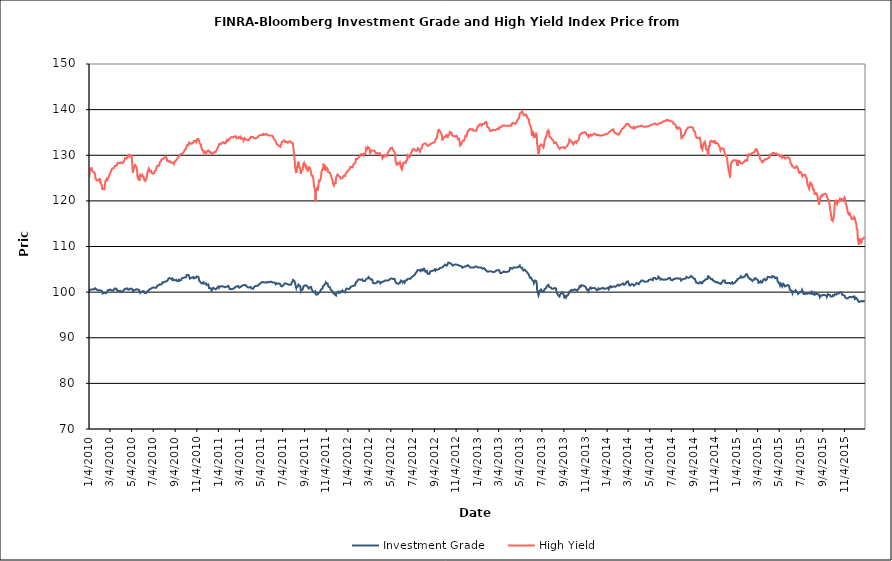
| Category | Investment Grade | High Yield |
|---|---|---|
| 1/4/10 | 100.102 | 125.163 |
| 1/5/10 | 100.49 | 125.873 |
| 1/6/10 | 100.447 | 126.69 |
| 1/7/10 | 100.503 | 127.071 |
| 1/8/10 | 100.542 | 127.104 |
| 1/11/10 | 100.559 | 127.199 |
| 1/12/10 | 100.775 | 126.595 |
| 1/13/10 | 100.668 | 126.609 |
| 1/14/10 | 100.647 | 126.495 |
| 1/15/10 | 100.825 | 126.376 |
| 1/19/10 | 100.604 | 126.186 |
| 1/20/10 | 100.724 | 126.008 |
| 1/21/10 | 100.842 | 125.662 |
| 1/22/10 | 100.705 | 124.921 |
| 1/25/10 | 100.59 | 124.498 |
| 1/26/10 | 100.603 | 124.395 |
| 1/27/10 | 100.508 | 124.599 |
| 1/28/10 | 100.405 | 124.548 |
| 1/29/10 | 100.417 | 124.508 |
| 2/1/10 | 100.394 | 124.505 |
| 2/2/10 | 100.469 | 124.725 |
| 2/3/10 | 100.363 | 124.969 |
| 2/4/10 | 100.396 | 124.762 |
| 2/5/10 | 100.385 | 123.977 |
| 2/8/10 | 100.291 | 123.526 |
| 2/9/10 | 100.167 | 123.238 |
| 2/10/10 | 99.997 | 122.602 |
| 2/11/10 | 99.691 | 122.473 |
| 2/12/10 | 99.896 | 122.576 |
| 2/16/10 | 99.868 | 122.529 |
| 2/17/10 | 99.849 | 123.433 |
| 2/18/10 | 99.79 | 123.864 |
| 2/19/10 | 99.757 | 124.339 |
| 2/22/10 | 99.858 | 124.755 |
| 2/23/10 | 100.056 | 124.527 |
| 2/24/10 | 100.143 | 124.602 |
| 2/25/10 | 100.208 | 124.538 |
| 2/26/10 | 100.466 | 124.842 |
| 3/1/10 | 100.447 | 125.466 |
| 3/2/10 | 100.481 | 125.66 |
| 3/3/10 | 100.547 | 125.78 |
| 3/4/10 | 100.572 | 125.898 |
| 3/5/10 | 100.406 | 126.217 |
| 3/8/10 | 100.383 | 126.711 |
| 3/9/10 | 100.445 | 126.852 |
| 3/10/10 | 100.329 | 127.106 |
| 3/11/10 | 100.316 | 127.14 |
| 3/12/10 | 100.488 | 127.262 |
| 3/15/10 | 100.522 | 127.212 |
| 3/16/10 | 100.654 | 127.15 |
| 3/17/10 | 100.794 | 127.664 |
| 3/18/10 | 100.787 | 127.842 |
| 3/19/10 | 100.77 | 127.776 |
| 3/22/10 | 100.728 | 127.676 |
| 3/23/10 | 100.762 | 127.779 |
| 3/24/10 | 100.328 | 128.048 |
| 3/25/10 | 100.142 | 128.082 |
| 3/26/10 | 100.176 | 128.355 |
| 3/29/10 | 100.218 | 128.357 |
| 3/30/10 | 100.26 | 128.526 |
| 3/31/10 | 100.4 | 128.354 |
| 4/1/10 | 100.318 | 128.234 |
| 4/5/10 | 99.992 | 128.435 |
| 4/6/10 | 99.974 | 128.282 |
| 4/7/10 | 100.148 | 128.468 |
| 4/8/10 | 100.17 | 128.282 |
| 4/9/10 | 100.252 | 128.463 |
| 4/12/10 | 100.46 | 128.647 |
| 4/13/10 | 100.602 | 128.822 |
| 4/14/10 | 100.658 | 129.085 |
| 4/15/10 | 100.72 | 129.378 |
| 4/16/10 | 100.861 | 129.541 |
| 4/19/10 | 100.72 | 129.254 |
| 4/20/10 | 100.713 | 129.364 |
| 4/21/10 | 100.841 | 129.516 |
| 4/22/10 | 100.818 | 129.413 |
| 4/23/10 | 100.588 | 129.707 |
| 4/26/10 | 100.539 | 130.023 |
| 4/27/10 | 100.749 | 129.974 |
| 4/28/10 | 100.637 | 129.76 |
| 4/29/10 | 100.695 | 130.026 |
| 4/30/10 | 100.908 | 129.932 |
| 5/3/10 | 100.788 | 129.878 |
| 5/4/10 | 100.905 | 129.637 |
| 5/5/10 | 100.862 | 128.685 |
| 5/6/10 | 100.609 | 127.446 |
| 5/7/10 | 100.233 | 126.211 |
| 5/10/10 | 100.404 | 127.273 |
| 5/11/10 | 100.358 | 127.056 |
| 5/12/10 | 100.306 | 127.684 |
| 5/13/10 | 100.48 | 128.088 |
| 5/14/10 | 100.68 | 127.605 |
| 5/17/10 | 100.617 | 127.473 |
| 5/18/10 | 100.721 | 127.395 |
| 5/19/10 | 100.652 | 126.706 |
| 5/20/10 | 100.6 | 125.442 |
| 5/21/10 | 100.415 | 125.086 |
| 5/24/10 | 100.481 | 125.319 |
| 5/25/10 | 100.136 | 124.396 |
| 5/26/10 | 100.104 | 124.91 |
| 5/27/10 | 99.874 | 125.323 |
| 5/28/10 | 100.099 | 125.704 |
| 6/1/10 | 100.03 | 125.412 |
| 6/2/10 | 99.906 | 125.392 |
| 6/3/10 | 99.946 | 125.704 |
| 6/4/10 | 100.231 | 125.471 |
| 6/7/10 | 100.206 | 125.2 |
| 6/8/10 | 100.11 | 124.677 |
| 6/9/10 | 100.083 | 124.67 |
| 6/10/10 | 99.801 | 124.634 |
| 6/11/10 | 99.808 | 124.35 |
| 6/14/10 | 99.829 | 124.765 |
| 6/15/10 | 99.86 | 125.1 |
| 6/16/10 | 99.92 | 125.477 |
| 6/17/10 | 100.239 | 126.08 |
| 6/18/10 | 100.29 | 126.379 |
| 6/21/10 | 100.344 | 127.069 |
| 6/22/10 | 100.487 | 126.885 |
| 6/23/10 | 100.61 | 126.856 |
| 6/24/10 | 100.569 | 126.505 |
| 6/25/10 | 100.558 | 126.6 |
| 6/28/10 | 100.784 | 126.599 |
| 6/29/10 | 100.881 | 126.131 |
| 6/30/10 | 100.978 | 126.332 |
| 7/1/10 | 100.965 | 125.953 |
| 7/2/10 | 100.974 | 125.967 |
| 7/6/10 | 101.028 | 126.06 |
| 7/7/10 | 100.928 | 126.207 |
| 7/8/10 | 100.951 | 126.563 |
| 7/9/10 | 100.945 | 126.756 |
| 7/12/10 | 100.939 | 126.793 |
| 7/13/10 | 100.992 | 127.434 |
| 7/14/10 | 100.998 | 127.449 |
| 7/15/10 | 101.414 | 127.578 |
| 7/16/10 | 101.574 | 127.717 |
| 7/19/10 | 101.508 | 127.688 |
| 7/20/10 | 101.593 | 127.776 |
| 7/21/10 | 101.672 | 127.949 |
| 7/22/10 | 101.721 | 128.3 |
| 7/23/10 | 101.691 | 128.582 |
| 7/26/10 | 101.665 | 128.726 |
| 7/27/10 | 101.716 | 129.049 |
| 7/28/10 | 101.723 | 129.168 |
| 7/29/10 | 101.885 | 128.993 |
| 7/30/10 | 102.177 | 129.176 |
| 8/2/10 | 102.135 | 129.303 |
| 8/3/10 | 102.299 | 129.487 |
| 8/4/10 | 102.207 | 129.465 |
| 8/5/10 | 102.25 | 129.5 |
| 8/6/10 | 102.431 | 129.631 |
| 8/9/10 | 102.373 | 129.675 |
| 8/10/10 | 102.438 | 129.445 |
| 8/11/10 | 102.495 | 129.168 |
| 8/12/10 | 102.453 | 128.755 |
| 8/13/10 | 102.521 | 128.568 |
| 8/16/10 | 102.995 | 128.643 |
| 8/17/10 | 102.924 | 128.731 |
| 8/18/10 | 102.975 | 128.831 |
| 8/19/10 | 103.087 | 128.733 |
| 8/20/10 | 102.992 | 128.508 |
| 8/23/10 | 102.902 | 128.534 |
| 8/24/10 | 103.11 | 128.37 |
| 8/25/10 | 103.069 | 128.303 |
| 8/26/10 | 103.004 | 128.195 |
| 8/27/10 | 102.638 | 128.262 |
| 8/30/10 | 102.77 | 128.382 |
| 8/31/10 | 102.91 | 128.147 |
| 9/1/10 | 102.667 | 128.36 |
| 9/2/10 | 102.558 | 128.62 |
| 9/3/10 | 102.437 | 128.836 |
| 9/7/10 | 102.695 | 128.945 |
| 9/8/10 | 102.694 | 128.974 |
| 9/9/10 | 102.414 | 129.155 |
| 9/10/10 | 102.242 | 129.258 |
| 9/13/10 | 102.438 | 129.602 |
| 9/14/10 | 102.704 | 129.521 |
| 9/15/10 | 102.649 | 129.674 |
| 9/16/10 | 102.499 | 130.074 |
| 9/17/10 | 102.528 | 130.135 |
| 9/20/10 | 102.632 | 130.295 |
| 9/21/10 | 102.768 | 130.466 |
| 9/22/10 | 103.038 | 130.485 |
| 9/23/10 | 103.079 | 130.298 |
| 9/24/10 | 102.892 | 130.335 |
| 9/27/10 | 103.136 | 130.598 |
| 9/28/10 | 103.196 | 130.688 |
| 9/29/10 | 103.217 | 130.894 |
| 9/30/10 | 103.213 | 131.102 |
| 10/1/10 | 103.293 | 131.255 |
| 10/4/10 | 103.25 | 131.415 |
| 10/5/10 | 103.36 | 131.667 |
| 10/6/10 | 103.777 | 131.956 |
| 10/7/10 | 103.821 | 132.099 |
| 10/8/10 | 103.882 | 132.244 |
| 10/11/10 | 103.749 | 132.212 |
| 10/12/10 | 103.668 | 132.314 |
| 10/13/10 | 103.535 | 132.793 |
| 10/14/10 | 103.235 | 132.644 |
| 10/15/10 | 102.972 | 132.584 |
| 10/18/10 | 103.11 | 132.508 |
| 10/19/10 | 103.211 | 132.456 |
| 10/20/10 | 103.237 | 132.329 |
| 10/21/10 | 103.168 | 132.579 |
| 10/22/10 | 103.146 | 132.563 |
| 10/25/10 | 103.321 | 132.824 |
| 10/26/10 | 103.025 | 133.129 |
| 10/27/10 | 102.808 | 133.066 |
| 10/28/10 | 102.914 | 133.18 |
| 10/29/10 | 103.11 | 133.087 |
| 11/1/10 | 103.142 | 133.192 |
| 11/2/10 | 103.332 | 132.962 |
| 11/3/10 | 103.438 | 133.19 |
| 11/4/10 | 103.58 | 133.536 |
| 11/5/10 | 103.406 | 133.536 |
| 11/8/10 | 103.31 | 133.557 |
| 11/9/10 | 103.055 | 133.593 |
| 11/10/10 | 102.564 | 133.022 |
| 11/11/10 | 102.616 | 132.97 |
| 11/12/10 | 102.468 | 132.524 |
| 11/15/10 | 102.045 | 132.371 |
| 11/16/10 | 101.932 | 131.763 |
| 11/17/10 | 102.112 | 131.511 |
| 11/18/10 | 101.897 | 131.639 |
| 11/19/10 | 102.054 | 131.122 |
| 11/22/10 | 102.165 | 131.019 |
| 11/23/10 | 102.278 | 130.588 |
| 11/24/10 | 101.864 | 130.542 |
| 11/26/10 | 101.863 | 130.744 |
| 11/29/10 | 101.922 | 130.291 |
| 11/30/10 | 102.022 | 130.145 |
| 12/1/10 | 101.568 | 130.481 |
| 12/2/10 | 101.476 | 130.838 |
| 12/3/10 | 101.519 | 130.961 |
| 12/6/10 | 101.694 | 131.045 |
| 12/7/10 | 101.352 | 131.156 |
| 12/8/10 | 100.876 | 130.842 |
| 12/9/10 | 100.991 | 130.879 |
| 12/10/10 | 100.934 | 130.643 |
| 12/13/10 | 100.857 | 130.642 |
| 12/14/10 | 100.596 | 130.565 |
| 12/15/10 | 100.33 | 130.335 |
| 12/16/10 | 100.307 | 130.398 |
| 12/17/10 | 100.602 | 130.396 |
| 12/20/10 | 100.943 | 130.42 |
| 12/21/10 | 100.841 | 130.656 |
| 12/22/10 | 100.868 | 130.633 |
| 12/23/10 | 100.766 | 130.815 |
| 12/27/10 | 100.627 | 130.708 |
| 12/28/10 | 100.526 | 130.99 |
| 12/29/10 | 100.688 | 131.074 |
| 12/30/10 | 100.846 | 131.261 |
| 12/31/10 | 101.042 | 131.455 |
| 1/3/11 | 101.208 | 131.858 |
| 1/4/11 | 101.316 | 132.091 |
| 1/5/11 | 100.937 | 132.302 |
| 1/6/11 | 100.955 | 132.482 |
| 1/7/11 | 101.214 | 132.404 |
| 1/10/11 | 101.247 | 132.434 |
| 1/11/11 | 101.24 | 132.58 |
| 1/12/11 | 101.18 | 132.636 |
| 1/13/11 | 101.307 | 132.753 |
| 1/14/11 | 101.392 | 132.788 |
| 1/18/11 | 101.21 | 132.849 |
| 1/19/11 | 101.349 | 132.835 |
| 1/20/11 | 101.094 | 132.594 |
| 1/21/11 | 101.074 | 132.574 |
| 1/24/11 | 101.163 | 132.632 |
| 1/25/11 | 101.328 | 132.944 |
| 1/26/11 | 101.147 | 133.021 |
| 1/27/11 | 101.186 | 133.283 |
| 1/28/11 | 101.332 | 133.054 |
| 1/31/11 | 101.371 | 133.197 |
| 2/1/11 | 101.177 | 133.376 |
| 2/2/11 | 101.113 | 133.508 |
| 2/3/11 | 100.901 | 133.416 |
| 2/4/11 | 100.688 | 133.653 |
| 2/7/11 | 100.708 | 133.883 |
| 2/8/11 | 100.678 | 134.026 |
| 2/9/11 | 100.64 | 134.065 |
| 2/10/11 | 100.635 | 134.006 |
| 2/11/11 | 100.689 | 133.906 |
| 2/14/11 | 100.76 | 133.89 |
| 2/15/11 | 100.792 | 133.913 |
| 2/16/11 | 100.816 | 134.016 |
| 2/17/11 | 100.877 | 134.107 |
| 2/18/11 | 100.849 | 134.178 |
| 2/22/11 | 101.209 | 134.145 |
| 2/23/11 | 101.204 | 133.96 |
| 2/24/11 | 101.068 | 133.689 |
| 2/25/11 | 101.217 | 133.737 |
| 2/28/11 | 101.347 | 133.797 |
| 3/1/11 | 101.398 | 133.935 |
| 3/2/11 | 101.379 | 133.992 |
| 3/3/11 | 100.969 | 134.003 |
| 3/4/11 | 101.076 | 133.893 |
| 3/7/11 | 101.137 | 133.668 |
| 3/8/11 | 101.019 | 133.964 |
| 3/9/11 | 101.172 | 133.956 |
| 3/10/11 | 101.344 | 133.656 |
| 3/11/11 | 101.44 | 133.576 |
| 3/14/11 | 101.514 | 133.638 |
| 3/15/11 | 101.535 | 133.214 |
| 3/16/11 | 101.719 | 133.178 |
| 3/17/11 | 101.535 | 133.421 |
| 3/18/11 | 101.606 | 133.749 |
| 3/21/11 | 101.533 | 133.484 |
| 3/22/11 | 101.512 | 133.544 |
| 3/23/11 | 101.421 | 133.408 |
| 3/24/11 | 101.267 | 133.44 |
| 3/25/11 | 101.138 | 133.353 |
| 3/28/11 | 101.016 | 133.284 |
| 3/29/11 | 100.882 | 133.292 |
| 3/30/11 | 100.871 | 133.463 |
| 3/31/11 | 101.038 | 133.352 |
| 4/1/11 | 100.887 | 133.702 |
| 4/4/11 | 101.136 | 133.797 |
| 4/5/11 | 100.963 | 134.02 |
| 4/6/11 | 100.836 | 133.92 |
| 4/7/11 | 100.781 | 133.902 |
| 4/8/11 | 100.76 | 134.004 |
| 4/11/11 | 100.727 | 134.028 |
| 4/12/11 | 100.924 | 133.848 |
| 4/13/11 | 101.032 | 133.808 |
| 4/14/11 | 101.001 | 133.714 |
| 4/15/11 | 101.239 | 133.871 |
| 4/18/11 | 101.36 | 133.65 |
| 4/19/11 | 101.451 | 133.651 |
| 4/20/11 | 101.424 | 133.737 |
| 4/21/11 | 101.387 | 133.825 |
| 4/25/11 | 101.419 | 133.988 |
| 4/26/11 | 101.611 | 134.092 |
| 4/27/11 | 101.48 | 134.04 |
| 4/28/11 | 101.708 | 134.311 |
| 4/29/11 | 101.828 | 134.333 |
| 5/2/11 | 101.906 | 134.443 |
| 5/3/11 | 101.997 | 134.32 |
| 5/4/11 | 102.075 | 134.479 |
| 5/5/11 | 102.171 | 134.418 |
| 5/6/11 | 102.158 | 134.578 |
| 5/9/11 | 102.209 | 134.425 |
| 5/10/11 | 102.082 | 134.688 |
| 5/11/11 | 102.109 | 134.7 |
| 5/12/11 | 102.099 | 134.527 |
| 5/13/11 | 102.138 | 134.491 |
| 5/16/11 | 102.149 | 134.632 |
| 5/17/11 | 102.353 | 134.587 |
| 5/18/11 | 102.212 | 134.566 |
| 5/19/11 | 102.07 | 134.636 |
| 5/20/11 | 102.132 | 134.542 |
| 5/23/11 | 102.226 | 134.352 |
| 5/24/11 | 102.138 | 134.411 |
| 5/25/11 | 102.088 | 134.326 |
| 5/26/11 | 102.164 | 134.342 |
| 5/27/11 | 102.195 | 134.51 |
| 5/31/11 | 102.313 | 134.338 |
| 6/1/11 | 102.499 | 134.385 |
| 6/2/11 | 102.253 | 134.221 |
| 6/3/11 | 102.189 | 134.283 |
| 6/6/11 | 102.12 | 134.159 |
| 6/7/11 | 102.072 | 133.967 |
| 6/8/11 | 102.173 | 133.704 |
| 6/9/11 | 102.106 | 133.568 |
| 6/10/11 | 102.076 | 133.506 |
| 6/13/11 | 102.012 | 133.153 |
| 6/14/11 | 101.73 | 133.037 |
| 6/15/11 | 101.868 | 132.872 |
| 6/16/11 | 101.948 | 132.554 |
| 6/17/11 | 101.926 | 132.653 |
| 6/20/11 | 101.853 | 132.269 |
| 6/21/11 | 101.876 | 132.267 |
| 6/22/11 | 101.873 | 132.44 |
| 6/23/11 | 101.908 | 132.05 |
| 6/24/11 | 102.002 | 132.113 |
| 6/27/11 | 101.741 | 131.865 |
| 6/28/11 | 101.402 | 132.191 |
| 6/29/11 | 101.26 | 132.363 |
| 6/30/11 | 101.2 | 132.454 |
| 7/1/11 | 101.237 | 132.902 |
| 7/5/11 | 101.449 | 133.029 |
| 7/6/11 | 101.506 | 133.115 |
| 7/7/11 | 101.395 | 133.231 |
| 7/8/11 | 101.8 | 133.28 |
| 7/11/11 | 101.933 | 132.888 |
| 7/12/11 | 102.014 | 132.784 |
| 7/13/11 | 102.042 | 132.957 |
| 7/14/11 | 101.89 | 132.999 |
| 7/15/11 | 101.851 | 132.866 |
| 7/18/11 | 101.732 | 132.724 |
| 7/19/11 | 101.677 | 132.722 |
| 7/20/11 | 101.802 | 132.936 |
| 7/21/11 | 101.598 | 133.028 |
| 7/22/11 | 101.707 | 133.068 |
| 7/25/11 | 101.6 | 133.049 |
| 7/26/11 | 101.668 | 133.246 |
| 7/27/11 | 101.671 | 132.951 |
| 7/28/11 | 101.71 | 132.748 |
| 7/29/11 | 102.101 | 132.541 |
| 8/1/11 | 102.445 | 132.668 |
| 8/2/11 | 102.69 | 132.126 |
| 8/3/11 | 102.765 | 131.582 |
| 8/4/11 | 102.858 | 130.856 |
| 8/5/11 | 102.526 | 130.297 |
| 8/8/11 | 101.818 | 127.319 |
| 8/9/11 | 101.642 | 126.715 |
| 8/10/11 | 101.666 | 126.678 |
| 8/11/11 | 100.881 | 126.106 |
| 8/12/11 | 101.126 | 127.015 |
| 8/15/11 | 101.191 | 127.903 |
| 8/16/11 | 101.405 | 128.042 |
| 8/17/11 | 101.631 | 128.573 |
| 8/18/11 | 101.692 | 127.705 |
| 8/19/11 | 101.529 | 127.395 |
| 8/22/11 | 101.314 | 127.264 |
| 8/23/11 | 100.821 | 126.282 |
| 8/24/11 | 100.273 | 125.927 |
| 8/25/11 | 100.448 | 126.498 |
| 8/26/11 | 100.592 | 126.715 |
| 8/29/11 | 100.573 | 126.885 |
| 8/30/11 | 101.003 | 127.033 |
| 8/31/11 | 101.14 | 128.078 |
| 9/1/11 | 101.324 | 128.205 |
| 9/2/11 | 101.474 | 128.365 |
| 9/6/11 | 101.516 | 127.515 |
| 9/7/11 | 101.486 | 127.765 |
| 9/8/11 | 101.502 | 127.727 |
| 9/9/11 | 101.426 | 127.519 |
| 9/12/11 | 101.178 | 126.474 |
| 9/13/11 | 100.959 | 126.623 |
| 9/14/11 | 100.983 | 127.097 |
| 9/15/11 | 100.799 | 127.314 |
| 9/16/11 | 100.88 | 127.409 |
| 9/19/11 | 101.097 | 127.172 |
| 9/20/11 | 101.095 | 127.29 |
| 9/21/11 | 101.153 | 127.116 |
| 9/22/11 | 101.108 | 125.995 |
| 9/23/11 | 100.647 | 125.52 |
| 9/26/11 | 100.298 | 125.465 |
| 9/27/11 | 100.058 | 125.611 |
| 9/28/11 | 99.924 | 124.851 |
| 9/29/11 | 99.972 | 124.344 |
| 9/30/11 | 99.996 | 123.273 |
| 10/3/11 | 100.148 | 122.236 |
| 10/4/11 | 99.594 | 119.881 |
| 10/5/11 | 99.418 | 120.775 |
| 10/6/11 | 99.443 | 122.277 |
| 10/7/11 | 99.434 | 122.768 |
| 10/10/11 | 99.517 | 122.852 |
| 10/11/11 | 99.353 | 122.3 |
| 10/12/11 | 99.527 | 123.376 |
| 10/13/11 | 99.78 | 123.672 |
| 10/14/11 | 99.81 | 124.466 |
| 10/17/11 | 100.031 | 124.417 |
| 10/18/11 | 100.25 | 124.296 |
| 10/19/11 | 100.53 | 124.939 |
| 10/20/11 | 100.68 | 125.541 |
| 10/21/11 | 100.707 | 126.394 |
| 10/24/11 | 100.807 | 126.914 |
| 10/25/11 | 101.264 | 127.167 |
| 10/26/11 | 101.368 | 126.792 |
| 10/27/11 | 101.348 | 127.975 |
| 10/28/11 | 101.463 | 127.875 |
| 10/31/11 | 101.784 | 127.696 |
| 11/1/11 | 101.959 | 126.648 |
| 11/2/11 | 102.125 | 126.978 |
| 11/3/11 | 102.008 | 127.376 |
| 11/4/11 | 101.874 | 127.162 |
| 11/7/11 | 101.905 | 127.097 |
| 11/8/11 | 101.595 | 127.239 |
| 11/9/11 | 101.39 | 126.322 |
| 11/10/11 | 101.173 | 126.414 |
| 11/11/11 | 101.238 | 126.491 |
| 11/14/11 | 101.069 | 126.17 |
| 11/15/11 | 100.767 | 125.82 |
| 11/16/11 | 100.761 | 125.629 |
| 11/17/11 | 100.469 | 125.434 |
| 11/18/11 | 100.413 | 125.196 |
| 11/21/11 | 100.183 | 124.532 |
| 11/22/11 | 99.951 | 123.879 |
| 11/23/11 | 99.805 | 123.809 |
| 11/25/11 | 99.664 | 123.358 |
| 11/28/11 | 99.47 | 124.094 |
| 11/29/11 | 99.414 | 123.689 |
| 11/30/11 | 99.404 | 124.084 |
| 12/1/11 | 99.27 | 124.86 |
| 12/2/11 | 99.785 | 125.29 |
| 12/5/11 | 99.93 | 125.775 |
| 12/6/11 | 99.982 | 125.795 |
| 12/7/11 | 99.949 | 125.612 |
| 12/8/11 | 100.115 | 125.538 |
| 12/9/11 | 99.872 | 125.454 |
| 12/12/11 | 99.867 | 125.317 |
| 12/13/11 | 99.906 | 125.158 |
| 12/14/11 | 100 | 124.913 |
| 12/15/11 | 100.134 | 124.961 |
| 12/16/11 | 100.313 | 125.058 |
| 12/19/11 | 100.375 | 124.938 |
| 12/20/11 | 100.196 | 125.175 |
| 12/21/11 | 100.097 | 125.223 |
| 12/22/11 | 100.134 | 125.503 |
| 12/23/11 | 100.016 | 125.63 |
| 12/27/11 | 99.947 | 125.464 |
| 12/28/11 | 100.421 | 125.864 |
| 12/29/11 | 100.555 | 126.044 |
| 12/30/11 | 100.774 | 126.162 |
| 1/3/12 | 100.742 | 126.521 |
| 1/4/12 | 100.597 | 126.529 |
| 1/5/12 | 100.548 | 126.663 |
| 1/6/12 | 100.672 | 126.824 |
| 1/9/12 | 100.818 | 127.016 |
| 1/10/12 | 100.91 | 127.393 |
| 1/11/12 | 101.119 | 127.414 |
| 1/12/12 | 101.246 | 127.571 |
| 1/13/12 | 101.324 | 127.463 |
| 1/17/12 | 101.365 | 127.36 |
| 1/18/12 | 101.455 | 127.435 |
| 1/19/12 | 101.448 | 128.026 |
| 1/20/12 | 101.421 | 128.07 |
| 1/23/12 | 101.433 | 128.175 |
| 1/24/12 | 101.349 | 128.221 |
| 1/25/12 | 101.65 | 128.487 |
| 1/26/12 | 102.102 | 129.167 |
| 1/27/12 | 102.266 | 129.213 |
| 1/30/12 | 102.431 | 129.164 |
| 1/31/12 | 102.58 | 129.039 |
| 2/1/12 | 102.574 | 129.405 |
| 2/2/12 | 102.767 | 129.511 |
| 2/3/12 | 102.65 | 129.574 |
| 2/6/12 | 102.774 | 129.798 |
| 2/7/12 | 102.668 | 129.809 |
| 2/8/12 | 102.826 | 130.217 |
| 2/9/12 | 102.679 | 130.377 |
| 2/10/12 | 102.743 | 130.002 |
| 2/13/12 | 102.811 | 130.239 |
| 2/14/12 | 102.821 | 130.083 |
| 2/15/12 | 102.83 | 130.106 |
| 2/16/12 | 102.429 | 129.967 |
| 2/17/12 | 102.479 | 130.307 |
| 2/21/12 | 102.463 | 130.284 |
| 2/22/12 | 102.57 | 130.67 |
| 2/23/12 | 102.664 | 130.956 |
| 2/24/12 | 102.855 | 131.597 |
| 2/27/12 | 103.004 | 131.368 |
| 2/28/12 | 103.144 | 131.529 |
| 2/29/12 | 103.205 | 131.808 |
| 3/1/12 | 103.025 | 131.852 |
| 3/2/12 | 103.284 | 131.736 |
| 3/5/12 | 103.056 | 131.389 |
| 3/6/12 | 102.929 | 130.339 |
| 3/7/12 | 102.889 | 130.576 |
| 3/8/12 | 102.775 | 130.669 |
| 3/9/12 | 102.69 | 131.049 |
| 3/12/12 | 102.756 | 131.049 |
| 3/13/12 | 102.485 | 131.146 |
| 3/14/12 | 102.022 | 131.244 |
| 3/15/12 | 101.978 | 131.069 |
| 3/16/12 | 102.017 | 131.099 |
| 3/19/12 | 101.918 | 130.958 |
| 3/20/12 | 101.786 | 130.727 |
| 3/21/12 | 102.027 | 130.902 |
| 3/22/12 | 101.958 | 130.559 |
| 3/23/12 | 102.123 | 130.411 |
| 3/26/12 | 102.121 | 130.481 |
| 3/27/12 | 102.364 | 130.583 |
| 3/28/12 | 102.343 | 130.551 |
| 3/29/12 | 102.348 | 130.289 |
| 3/30/12 | 102.304 | 130.504 |
| 4/2/12 | 102.275 | 130.507 |
| 4/3/12 | 102.178 | 130.54 |
| 4/4/12 | 101.896 | 130.313 |
| 4/5/12 | 101.959 | 130.066 |
| 4/9/12 | 102.29 | 129.724 |
| 4/10/12 | 102.336 | 129.341 |
| 4/11/12 | 102.227 | 129.316 |
| 4/12/12 | 102.258 | 129.646 |
| 4/13/12 | 102.438 | 129.816 |
| 4/16/12 | 102.512 | 129.715 |
| 4/17/12 | 102.447 | 129.998 |
| 4/18/12 | 102.478 | 130.062 |
| 4/19/12 | 102.542 | 130 |
| 4/20/12 | 102.456 | 130.072 |
| 4/23/12 | 102.528 | 129.844 |
| 4/24/12 | 102.45 | 130.122 |
| 4/25/12 | 102.376 | 130.54 |
| 4/26/12 | 102.526 | 130.61 |
| 4/27/12 | 102.624 | 130.774 |
| 4/30/12 | 102.764 | 131.097 |
| 5/1/12 | 102.747 | 131.422 |
| 5/2/12 | 102.891 | 131.549 |
| 5/3/12 | 102.958 | 131.559 |
| 5/4/12 | 103.036 | 131.564 |
| 5/7/12 | 102.967 | 131.646 |
| 5/8/12 | 103.069 | 131.43 |
| 5/9/12 | 102.922 | 131.22 |
| 5/10/12 | 102.853 | 131.368 |
| 5/11/12 | 102.937 | 131.343 |
| 5/14/12 | 102.896 | 130.719 |
| 5/15/12 | 102.777 | 130.618 |
| 5/16/12 | 102.436 | 130.036 |
| 5/17/12 | 102.22 | 128.787 |
| 5/18/12 | 102.02 | 128.397 |
| 5/21/12 | 101.935 | 127.807 |
| 5/22/12 | 101.836 | 128.404 |
| 5/23/12 | 101.909 | 128.029 |
| 5/24/12 | 101.806 | 128.076 |
| 5/25/12 | 101.934 | 128.245 |
| 5/29/12 | 102 | 128.512 |
| 5/30/12 | 102.241 | 128.252 |
| 5/31/12 | 102.454 | 128.088 |
| 6/1/12 | 102.529 | 127.354 |
| 6/4/12 | 102.342 | 126.898 |
| 6/5/12 | 102.151 | 126.694 |
| 6/6/12 | 102.104 | 127.566 |
| 6/7/12 | 102.302 | 128.314 |
| 6/8/12 | 102.404 | 128.144 |
| 6/11/12 | 102.405 | 128.406 |
| 6/12/12 | 102.158 | 128.202 |
| 6/13/12 | 102.242 | 128.297 |
| 6/14/12 | 102.219 | 128.278 |
| 6/15/12 | 102.624 | 128.671 |
| 6/18/12 | 102.678 | 128.831 |
| 6/19/12 | 102.678 | 129.471 |
| 6/20/12 | 102.731 | 129.982 |
| 6/21/12 | 102.928 | 130.01 |
| 6/22/12 | 102.86 | 129.877 |
| 6/25/12 | 102.926 | 129.569 |
| 6/26/12 | 102.827 | 129.662 |
| 6/27/12 | 102.871 | 129.855 |
| 6/28/12 | 102.95 | 129.949 |
| 6/29/12 | 102.908 | 130.465 |
| 7/2/12 | 103.372 | 130.772 |
| 7/3/12 | 103.438 | 131.071 |
| 7/5/12 | 103.483 | 131.238 |
| 7/6/12 | 103.617 | 131.405 |
| 7/9/12 | 103.743 | 131.298 |
| 7/10/12 | 103.882 | 131.313 |
| 7/11/12 | 103.974 | 131.355 |
| 7/12/12 | 104.078 | 130.988 |
| 7/13/12 | 104.213 | 131.017 |
| 7/16/12 | 104.502 | 130.976 |
| 7/17/12 | 104.542 | 130.994 |
| 7/18/12 | 104.84 | 131.143 |
| 7/19/12 | 104.904 | 131.518 |
| 7/20/12 | 104.869 | 131.357 |
| 7/23/12 | 104.76 | 131.103 |
| 7/24/12 | 104.857 | 130.931 |
| 7/25/12 | 104.856 | 130.805 |
| 7/26/12 | 104.899 | 131.091 |
| 7/27/12 | 104.627 | 131.355 |
| 7/30/12 | 104.84 | 131.604 |
| 7/31/12 | 105.028 | 131.948 |
| 8/1/12 | 104.967 | 132.255 |
| 8/2/12 | 105.058 | 132.124 |
| 8/3/12 | 104.808 | 132.261 |
| 8/6/12 | 105.018 | 132.559 |
| 8/7/12 | 104.746 | 132.745 |
| 8/8/12 | 104.638 | 132.59 |
| 8/9/12 | 104.469 | 132.581 |
| 8/10/12 | 104.646 | 132.362 |
| 8/13/12 | 104.659 | 132.342 |
| 8/14/12 | 104.381 | 132.345 |
| 8/15/12 | 104.02 | 132.073 |
| 8/16/12 | 103.908 | 132.068 |
| 8/17/12 | 103.944 | 132.003 |
| 8/20/12 | 103.998 | 132.164 |
| 8/21/12 | 104.025 | 132.365 |
| 8/22/12 | 104.353 | 132.42 |
| 8/23/12 | 104.574 | 132.471 |
| 8/24/12 | 104.535 | 132.536 |
| 8/27/12 | 104.634 | 132.588 |
| 8/28/12 | 104.679 | 132.662 |
| 8/29/12 | 104.564 | 132.576 |
| 8/30/12 | 104.666 | 132.748 |
| 8/31/12 | 104.854 | 132.757 |
| 9/4/12 | 104.974 | 132.816 |
| 9/5/12 | 104.888 | 132.819 |
| 9/6/12 | 104.737 | 133.125 |
| 9/7/12 | 104.978 | 133.605 |
| 9/10/12 | 104.878 | 133.705 |
| 9/11/12 | 104.922 | 134.088 |
| 9/12/12 | 104.881 | 134.64 |
| 9/13/12 | 104.964 | 134.936 |
| 9/14/12 | 104.926 | 135.468 |
| 9/17/12 | 105.058 | 135.563 |
| 9/18/12 | 105.16 | 135.387 |
| 9/19/12 | 105.306 | 135.375 |
| 9/20/12 | 105.214 | 135.117 |
| 9/21/12 | 105.236 | 135.047 |
| 9/24/12 | 105.353 | 134.578 |
| 9/25/12 | 105.333 | 134.277 |
| 9/26/12 | 105.396 | 133.268 |
| 9/27/12 | 105.535 | 133.642 |
| 9/28/12 | 105.652 | 133.797 |
| 10/1/12 | 105.785 | 133.896 |
| 10/2/12 | 105.876 | 133.835 |
| 10/3/12 | 105.971 | 133.992 |
| 10/4/12 | 106.042 | 134.162 |
| 10/5/12 | 105.919 | 134.321 |
| 10/8/12 | 105.81 | 134.45 |
| 10/9/12 | 105.946 | 134.131 |
| 10/10/12 | 105.923 | 133.801 |
| 10/11/12 | 106.139 | 134.188 |
| 10/12/12 | 106.424 | 134.299 |
| 10/15/12 | 106.445 | 134.521 |
| 10/16/12 | 106.447 | 134.767 |
| 10/17/12 | 106.444 | 135.122 |
| 10/18/12 | 106.326 | 135.204 |
| 10/19/12 | 106.271 | 135.012 |
| 10/22/12 | 106.114 | 134.922 |
| 10/23/12 | 105.996 | 134.365 |
| 10/24/12 | 105.971 | 134.527 |
| 10/25/12 | 105.806 | 134.564 |
| 10/26/12 | 105.938 | 134.21 |
| 10/29/12 | 105.958 | 134.185 |
| 10/30/12 | 105.958 | 134.185 |
| 10/31/12 | 106.102 | 134.104 |
| 11/1/12 | 106.069 | 134.15 |
| 11/2/12 | 106.005 | 134.287 |
| 11/5/12 | 106.032 | 134.281 |
| 11/6/12 | 105.82 | 134.439 |
| 11/7/12 | 105.9 | 133.937 |
| 11/8/12 | 105.923 | 133.875 |
| 11/9/12 | 105.877 | 133.542 |
| 11/12/12 | 105.86 | 133.603 |
| 11/13/12 | 105.873 | 133.044 |
| 11/14/12 | 105.848 | 132.789 |
| 11/15/12 | 105.744 | 132.136 |
| 11/16/12 | 105.693 | 131.979 |
| 11/19/12 | 105.653 | 132.5 |
| 11/20/12 | 105.532 | 132.869 |
| 11/21/12 | 105.358 | 132.945 |
| 11/23/12 | 105.388 | 133.147 |
| 11/26/12 | 105.534 | 133.19 |
| 11/27/12 | 105.586 | 133.501 |
| 11/28/12 | 105.642 | 133.554 |
| 11/29/12 | 105.643 | 133.926 |
| 11/30/12 | 105.715 | 134.285 |
| 12/3/12 | 105.696 | 134.168 |
| 12/4/12 | 105.727 | 134.386 |
| 12/5/12 | 105.874 | 134.874 |
| 12/6/12 | 105.901 | 135.085 |
| 12/7/12 | 105.741 | 135.362 |
| 12/10/12 | 105.722 | 135.452 |
| 12/11/12 | 105.635 | 135.61 |
| 12/12/12 | 105.563 | 135.761 |
| 12/13/12 | 105.422 | 135.826 |
| 12/14/12 | 105.506 | 135.725 |
| 12/17/12 | 105.385 | 135.641 |
| 12/18/12 | 105.191 | 135.742 |
| 12/19/12 | 105.36 | 135.775 |
| 12/20/12 | 105.386 | 135.706 |
| 12/21/12 | 105.493 | 135.434 |
| 12/24/12 | 105.382 | 135.434 |
| 12/26/12 | 105.438 | 135.223 |
| 12/27/12 | 105.63 | 135.36 |
| 12/28/12 | 105.717 | 135.388 |
| 12/31/12 | 105.623 | 135.388 |
| 1/2/13 | 105.494 | 136.004 |
| 1/3/13 | 105.419 | 136.223 |
| 1/4/13 | 105.349 | 136.418 |
| 1/7/13 | 105.428 | 136.539 |
| 1/8/13 | 105.485 | 136.567 |
| 1/9/13 | 105.45 | 136.666 |
| 1/10/13 | 105.382 | 136.791 |
| 1/11/13 | 105.347 | 136.887 |
| 1/14/13 | 105.372 | 136.76 |
| 1/15/13 | 105.348 | 136.538 |
| 1/16/13 | 105.332 | 136.64 |
| 1/17/13 | 105.127 | 136.744 |
| 1/18/13 | 105.195 | 136.872 |
| 1/22/13 | 105.239 | 136.901 |
| 1/23/13 | 105.259 | 137.065 |
| 1/24/13 | 105.154 | 137.18 |
| 1/25/13 | 104.918 | 137.344 |
| 1/28/13 | 104.671 | 137.292 |
| 1/29/13 | 104.628 | 136.915 |
| 1/30/13 | 104.462 | 136.633 |
| 1/31/13 | 104.489 | 136.183 |
| 2/1/13 | 104.509 | 136.3 |
| 2/4/13 | 104.516 | 135.996 |
| 2/5/13 | 104.38 | 135.778 |
| 2/6/13 | 104.452 | 135.607 |
| 2/7/13 | 104.557 | 135.447 |
| 2/8/13 | 104.482 | 135.313 |
| 2/11/13 | 104.548 | 135.322 |
| 2/12/13 | 104.435 | 135.393 |
| 2/13/13 | 104.331 | 135.446 |
| 2/14/13 | 104.432 | 135.524 |
| 2/15/13 | 104.394 | 135.504 |
| 2/19/13 | 104.387 | 135.572 |
| 2/20/13 | 104.348 | 135.627 |
| 2/21/13 | 104.499 | 135.402 |
| 2/22/13 | 104.557 | 135.485 |
| 2/25/13 | 104.756 | 135.664 |
| 2/26/13 | 104.841 | 135.55 |
| 2/27/13 | 104.778 | 135.597 |
| 2/28/13 | 104.777 | 135.799 |
| 3/1/13 | 104.858 | 135.684 |
| 3/4/13 | 104.85 | 135.753 |
| 3/5/13 | 104.754 | 136.111 |
| 3/6/13 | 104.599 | 136.122 |
| 3/7/13 | 104.412 | 136.133 |
| 3/8/13 | 104.18 | 136.117 |
| 3/11/13 | 104.184 | 136.2 |
| 3/12/13 | 104.331 | 136.304 |
| 3/13/13 | 104.278 | 136.283 |
| 3/14/13 | 104.276 | 136.504 |
| 3/15/13 | 104.401 | 136.543 |
| 3/18/13 | 104.535 | 136.549 |
| 3/19/13 | 104.67 | 136.561 |
| 3/20/13 | 104.466 | 136.574 |
| 3/21/13 | 104.428 | 136.487 |
| 3/22/13 | 104.404 | 136.502 |
| 3/25/13 | 104.386 | 136.448 |
| 3/26/13 | 104.316 | 136.408 |
| 3/27/13 | 104.488 | 136.442 |
| 3/28/13 | 104.489 | 136.483 |
| 4/1/13 | 104.516 | 136.479 |
| 4/2/13 | 104.463 | 136.55 |
| 4/3/13 | 104.642 | 136.537 |
| 4/4/13 | 104.92 | 136.53 |
| 4/5/13 | 105.293 | 136.496 |
| 4/8/13 | 105.29 | 136.464 |
| 4/9/13 | 105.304 | 136.717 |
| 4/10/13 | 105.125 | 136.822 |
| 4/11/13 | 105.12 | 137.05 |
| 4/12/13 | 105.316 | 137.192 |
| 4/15/13 | 105.424 | 137.038 |
| 4/16/13 | 105.369 | 137.111 |
| 4/17/13 | 105.389 | 136.936 |
| 4/18/13 | 105.407 | 136.862 |
| 4/19/13 | 105.346 | 136.955 |
| 4/22/13 | 105.406 | 137.056 |
| 4/23/13 | 105.46 | 137.317 |
| 4/24/13 | 105.498 | 137.459 |
| 4/25/13 | 105.38 | 137.639 |
| 4/26/13 | 105.595 | 137.856 |
| 4/29/13 | 105.615 | 138.038 |
| 4/30/13 | 105.612 | 138.388 |
| 5/1/13 | 105.781 | 138.733 |
| 5/2/13 | 105.844 | 138.955 |
| 5/3/13 | 105.494 | 139.201 |
| 5/6/13 | 105.353 | 139.261 |
| 5/7/13 | 105.329 | 139.46 |
| 5/8/13 | 105.359 | 139.652 |
| 5/9/13 | 105.342 | 139.604 |
| 5/10/13 | 104.923 | 139.359 |
| 5/13/13 | 104.727 | 138.947 |
| 5/14/13 | 104.694 | 138.789 |
| 5/15/13 | 104.673 | 138.724 |
| 5/16/13 | 104.927 | 138.831 |
| 5/17/13 | 104.738 | 138.852 |
| 5/20/13 | 104.621 | 138.896 |
| 5/21/13 | 104.661 | 138.85 |
| 5/22/13 | 104.462 | 138.759 |
| 5/23/13 | 104.301 | 138.269 |
| 5/24/13 | 104.298 | 138.075 |
| 5/28/13 | 103.825 | 137.844 |
| 5/29/13 | 103.525 | 137.043 |
| 5/30/13 | 103.475 | 136.973 |
| 5/31/13 | 103.159 | 136.601 |
| 6/3/13 | 103.169 | 135.944 |
| 6/4/13 | 102.987 | 135.582 |
| 6/5/13 | 102.781 | 134.538 |
| 6/6/13 | 102.788 | 134.224 |
| 6/7/13 | 102.678 | 135.191 |
| 6/10/13 | 102.314 | 134.939 |
| 6/11/13 | 101.98 | 133.85 |
| 6/12/13 | 102.018 | 134.087 |
| 6/13/13 | 102.11 | 133.805 |
| 6/14/13 | 102.545 | 134.401 |
| 6/17/13 | 102.474 | 134.746 |
| 6/18/13 | 102.164 | 134.589 |
| 6/19/13 | 101.914 | 134.457 |
| 6/20/13 | 100.588 | 132.485 |
| 6/21/13 | 100.219 | 132.116 |
| 6/24/13 | 99.311 | 130.267 |
| 6/25/13 | 99.469 | 130.422 |
| 6/26/13 | 99.857 | 131.058 |
| 6/27/13 | 100.266 | 131.995 |
| 6/28/13 | 100.357 | 132.199 |
| 7/1/13 | 100.575 | 132.38 |
| 7/2/13 | 100.774 | 132.5 |
| 7/3/13 | 100.789 | 132.233 |
| 7/5/13 | 100.052 | 132.062 |
| 7/8/13 | 100.063 | 131.702 |
| 7/9/13 | 100.261 | 131.99 |
| 7/10/13 | 100.23 | 132.194 |
| 7/11/13 | 100.65 | 133.132 |
| 7/12/13 | 100.778 | 133.422 |
| 7/15/13 | 100.866 | 133.956 |
| 7/16/13 | 101.036 | 134.184 |
| 7/17/13 | 101.286 | 134.476 |
| 7/18/13 | 101.274 | 135.077 |
| 7/19/13 | 101.435 | 135.209 |
| 7/22/13 | 101.6 | 135.45 |
| 7/23/13 | 101.546 | 135.437 |
| 7/24/13 | 101.125 | 134.763 |
| 7/25/13 | 100.927 | 134.065 |
| 7/26/13 | 101.109 | 134.013 |
| 7/29/13 | 101.003 | 133.854 |
| 7/30/13 | 100.974 | 133.888 |
| 7/31/13 | 100.761 | 133.596 |
| 8/1/13 | 100.577 | 133.583 |
| 8/2/13 | 100.839 | 133.403 |
| 8/5/13 | 100.724 | 133.206 |
| 8/6/13 | 100.666 | 132.905 |
| 8/7/13 | 100.771 | 132.644 |
| 8/8/13 | 100.906 | 132.743 |
| 8/9/13 | 100.882 | 132.811 |
| 8/12/13 | 100.814 | 132.845 |
| 8/13/13 | 100.327 | 132.628 |
| 8/14/13 | 100.232 | 132.676 |
| 8/15/13 | 99.756 | 132.339 |
| 8/16/13 | 99.565 | 132.204 |
| 8/19/13 | 99.254 | 131.767 |
| 8/20/13 | 99.406 | 131.634 |
| 8/21/13 | 99.234 | 131.571 |
| 8/22/13 | 99.051 | 131.404 |
| 8/23/13 | 99.367 | 131.617 |
| 8/26/13 | 99.636 | 131.681 |
| 8/27/13 | 99.89 | 131.589 |
| 8/28/13 | 99.751 | 131.599 |
| 8/29/13 | 99.819 | 131.721 |
| 8/30/13 | 99.969 | 131.931 |
| 9/3/13 | 99.443 | 131.767 |
| 9/4/13 | 99.4 | 131.735 |
| 9/5/13 | 98.833 | 131.503 |
| 9/6/13 | 99.036 | 131.534 |
| 9/9/13 | 99.126 | 131.762 |
| 9/10/13 | 98.881 | 131.688 |
| 9/11/13 | 98.985 | 131.774 |
| 9/12/13 | 99.199 | 132.012 |
| 9/13/13 | 99.132 | 132.108 |
| 9/16/13 | 99.445 | 132.49 |
| 9/17/13 | 99.387 | 132.526 |
| 9/18/13 | 99.587 | 132.801 |
| 9/19/13 | 100.13 | 133.454 |
| 9/20/13 | 100.145 | 133.463 |
| 9/23/13 | 100.222 | 133.158 |
| 9/24/13 | 100.458 | 133.178 |
| 9/25/13 | 100.57 | 133.037 |
| 9/26/13 | 100.459 | 132.947 |
| 9/27/13 | 100.477 | 132.761 |
| 9/30/13 | 100.36 | 132.403 |
| 10/1/13 | 100.351 | 132.559 |
| 10/2/13 | 100.5 | 132.65 |
| 10/3/13 | 100.614 | 132.895 |
| 10/4/13 | 100.436 | 132.974 |
| 10/7/13 | 100.499 | 133.004 |
| 10/8/13 | 100.458 | 132.84 |
| 10/9/13 | 100.359 | 132.765 |
| 10/10/13 | 100.309 | 133.012 |
| 10/11/13 | 100.536 | 133.183 |
| 10/14/13 | 100.578 | 133.263 |
| 10/15/13 | 100.404 | 133.285 |
| 10/16/13 | 100.541 | 133.539 |
| 10/17/13 | 101.066 | 134.085 |
| 10/18/13 | 101.3 | 134.484 |
| 10/21/13 | 101.202 | 134.622 |
| 10/22/13 | 101.507 | 134.843 |
| 10/23/13 | 101.575 | 134.752 |
| 10/24/13 | 101.454 | 134.8 |
| 10/25/13 | 101.475 | 134.836 |
| 10/28/13 | 101.432 | 134.984 |
| 10/29/13 | 101.425 | 134.988 |
| 10/30/13 | 101.524 | 135.037 |
| 10/31/13 | 101.352 | 135.022 |
| 11/1/13 | 101.143 | 134.905 |
| 11/4/13 | 101.125 | 135.008 |
| 11/5/13 | 100.846 | 134.753 |
| 11/6/13 | 100.906 | 134.761 |
| 11/7/13 | 100.99 | 134.746 |
| 11/8/13 | 100.473 | 134.373 |
| 11/11/13 | 100.506 | 134.437 |
| 11/12/13 | 100.257 | 134.002 |
| 11/13/13 | 100.423 | 133.829 |
| 11/14/13 | 100.717 | 134.11 |
| 11/15/13 | 100.772 | 134.271 |
| 11/18/13 | 101.031 | 134.561 |
| 11/19/13 | 100.928 | 134.495 |
| 11/20/13 | 100.749 | 134.418 |
| 11/21/13 | 100.578 | 134.251 |
| 11/22/13 | 100.784 | 134.462 |
| 11/25/13 | 100.926 | 134.532 |
| 11/26/13 | 101.066 | 134.489 |
| 11/27/13 | 100.968 | 134.694 |
| 11/29/13 | 100.926 | 134.769 |
| 12/2/13 | 100.715 | 134.59 |
| 12/3/13 | 100.783 | 134.592 |
| 12/4/13 | 100.522 | 134.448 |
| 12/5/13 | 100.422 | 134.378 |
| 12/6/13 | 100.434 | 134.486 |
| 12/9/13 | 100.55 | 134.531 |
| 12/10/13 | 100.804 | 134.606 |
| 12/11/13 | 100.783 | 134.549 |
| 12/12/13 | 100.616 | 134.316 |
| 12/13/13 | 100.656 | 134.34 |
| 12/16/13 | 100.77 | 134.355 |
| 12/17/13 | 100.883 | 134.318 |
| 12/18/13 | 100.862 | 134.256 |
| 12/19/13 | 100.784 | 134.28 |
| 12/20/13 | 100.91 | 134.382 |
| 12/23/13 | 100.94 | 134.459 |
| 12/24/13 | 100.826 | 134.433 |
| 12/26/13 | 100.715 | 134.462 |
| 12/27/13 | 100.661 | 134.544 |
| 12/30/13 | 100.78 | 134.644 |
| 12/31/13 | 100.835 | 134.665 |
| 1/2/14 | 100.818 | 134.61 |
| 1/3/14 | 100.821 | 134.675 |
| 1/6/14 | 100.947 | 134.841 |
| 1/7/14 | 100.979 | 135.053 |
| 1/8/14 | 100.662 | 135.04 |
| 1/9/14 | 100.703 | 135.072 |
| 1/10/14 | 101.104 | 135.228 |
| 1/13/14 | 101.302 | 135.332 |
| 1/14/14 | 101.168 | 135.33 |
| 1/15/14 | 101.05 | 135.493 |
| 1/16/14 | 101.186 | 135.513 |
| 1/17/14 | 101.214 | 135.694 |
| 1/21/14 | 101.237 | 135.657 |
| 1/22/14 | 101.077 | 135.696 |
| 1/23/14 | 101.165 | 135.526 |
| 1/24/14 | 101.225 | 135.025 |
| 1/27/14 | 101.165 | 134.766 |
| 1/28/14 | 101.185 | 134.798 |
| 1/29/14 | 101.336 | 134.736 |
| 1/30/14 | 101.366 | 134.782 |
| 1/31/14 | 101.431 | 134.664 |
| 2/3/14 | 101.636 | 134.541 |
| 2/4/14 | 101.583 | 134.457 |
| 2/5/14 | 101.42 | 134.361 |
| 2/6/14 | 101.393 | 134.536 |
| 2/7/14 | 101.592 | 134.888 |
| 2/10/14 | 101.615 | 135.076 |
| 2/11/14 | 101.498 | 135.216 |
| 2/12/14 | 101.418 | 135.441 |
| 2/13/14 | 101.69 | 135.543 |
| 2/14/14 | 101.753 | 135.746 |
| 2/18/14 | 101.892 | 135.952 |
| 2/19/14 | 101.879 | 136.044 |
| 2/20/14 | 101.613 | 136.097 |
| 2/21/14 | 101.699 | 136.258 |
| 2/24/14 | 101.732 | 136.482 |
| 2/25/14 | 101.989 | 136.691 |
| 2/26/14 | 102.079 | 136.809 |
| 2/27/14 | 102.222 | 136.918 |
| 2/28/14 | 102.211 | 137.009 |
| 3/3/14 | 102.364 | 136.884 |
| 3/4/14 | 102.118 | 136.915 |
| 3/5/14 | 102.048 | 136.916 |
| 3/6/14 | 101.816 | 136.684 |
| 3/7/14 | 101.497 | 136.459 |
| 3/10/14 | 101.461 | 136.253 |
| 3/11/14 | 101.46 | 136.252 |
| 3/12/14 | 101.557 | 136.142 |
| 3/13/14 | 101.718 | 136.026 |
| 3/14/14 | 101.769 | 135.809 |
| 3/17/14 | 101.717 | 135.965 |
| 3/18/14 | 101.749 | 136.072 |
| 3/19/14 | 101.649 | 136.191 |
| 3/20/14 | 101.412 | 135.875 |
| 3/21/14 | 101.566 | 136.086 |
| 3/24/14 | 101.667 | 136.015 |
| 3/25/14 | 101.737 | 136.04 |
| 3/26/14 | 101.878 | 136.252 |
| 3/27/14 | 101.987 | 136.119 |
| 3/28/14 | 101.878 | 136.233 |
| 3/31/14 | 101.852 | 136.266 |
| 4/1/14 | 101.868 | 136.261 |
| 4/2/14 | 101.643 | 136.321 |
| 4/3/14 | 101.764 | 136.337 |
| 4/4/14 | 102.025 | 136.448 |
| 4/7/14 | 102.21 | 136.349 |
| 4/8/14 | 102.242 | 136.393 |
| 4/9/14 | 102.266 | 136.486 |
| 4/10/14 | 102.532 | 136.521 |
| 4/11/14 | 102.573 | 136.311 |
| 4/14/14 | 102.531 | 136.308 |
| 4/15/14 | 102.544 | 136.227 |
| 4/16/14 | 102.487 | 136.253 |
| 4/17/14 | 102.346 | 136.257 |
| 4/21/14 | 102.277 | 136.247 |
| 4/22/14 | 102.207 | 136.279 |
| 4/23/14 | 102.343 | 136.332 |
| 4/24/14 | 102.303 | 136.334 |
| 4/25/14 | 102.421 | 136.355 |
| 4/28/14 | 102.328 | 136.308 |
| 4/29/14 | 102.243 | 136.341 |
| 4/30/14 | 102.413 | 136.464 |
| 5/1/14 | 102.654 | 136.42 |
| 5/2/14 | 102.735 | 136.585 |
| 5/5/14 | 102.752 | 136.518 |
| 5/6/14 | 102.75 | 136.554 |
| 5/7/14 | 102.757 | 136.59 |
| 5/8/14 | 102.825 | 136.629 |
| 5/9/14 | 102.765 | 136.738 |
| 5/12/14 | 102.608 | 136.757 |
| 5/13/14 | 102.76 | 136.86 |
| 5/14/14 | 103.095 | 136.951 |
| 5/15/14 | 103.233 | 136.892 |
| 5/16/14 | 103.154 | 136.848 |
| 5/19/14 | 103.118 | 136.968 |
| 5/20/14 | 103.068 | 136.874 |
| 5/21/14 | 102.909 | 136.849 |
| 5/22/14 | 102.817 | 136.739 |
| 5/23/14 | 102.956 | 136.771 |
| 5/27/14 | 102.996 | 136.726 |
| 5/28/14 | 103.368 | 136.78 |
| 5/29/14 | 103.4 | 136.844 |
| 5/30/14 | 103.25 | 136.989 |
| 6/2/14 | 102.997 | 137.03 |
| 6/3/14 | 102.747 | 136.843 |
| 6/4/14 | 102.639 | 136.861 |
| 6/5/14 | 102.724 | 137.095 |
| 6/6/14 | 102.858 | 137.239 |
| 6/9/14 | 102.774 | 137.321 |
| 6/10/14 | 102.652 | 137.409 |
| 6/11/14 | 102.666 | 137.46 |
| 6/12/14 | 102.706 | 137.448 |
| 6/13/14 | 102.744 | 137.427 |
| 6/16/14 | 102.763 | 137.473 |
| 6/17/14 | 102.566 | 137.403 |
| 6/18/14 | 102.647 | 137.424 |
| 6/19/14 | 102.775 | 137.698 |
| 6/20/14 | 102.697 | 137.723 |
| 6/23/14 | 102.846 | 137.779 |
| 6/24/14 | 102.88 | 137.797 |
| 6/25/14 | 103.059 | 137.699 |
| 6/26/14 | 103.117 | 137.613 |
| 6/27/14 | 103.111 | 137.582 |
| 6/30/14 | 103.096 | 137.543 |
| 7/1/14 | 102.92 | 137.521 |
| 7/2/14 | 102.692 | 137.487 |
| 7/3/14 | 102.53 | 137.445 |
| 7/7/14 | 102.607 | 137.369 |
| 7/8/14 | 102.82 | 137.259 |
| 7/9/14 | 102.778 | 137.102 |
| 7/10/14 | 102.892 | 136.873 |
| 7/11/14 | 102.97 | 136.858 |
| 7/14/14 | 102.883 | 136.783 |
| 7/15/14 | 102.808 | 136.662 |
| 7/16/14 | 102.837 | 136.489 |
| 7/17/14 | 103.023 | 136.093 |
| 7/18/14 | 102.976 | 135.884 |
| 7/21/14 | 103.018 | 135.786 |
| 7/22/14 | 103.027 | 135.911 |
| 7/23/14 | 103.133 | 136.146 |
| 7/24/14 | 102.926 | 136.135 |
| 7/25/14 | 103.053 | 136.103 |
| 7/28/14 | 103.005 | 135.916 |
| 7/29/14 | 103.084 | 135.842 |
| 7/30/14 | 102.775 | 135.555 |
| 7/31/14 | 102.536 | 134.442 |
| 8/1/14 | 102.65 | 133.751 |
| 8/4/14 | 102.794 | 133.906 |
| 8/5/14 | 102.693 | 134.262 |
| 8/6/14 | 102.743 | 134.202 |
| 8/7/14 | 102.903 | 134.308 |
| 8/8/14 | 103.015 | 134.39 |
| 8/11/14 | 102.911 | 134.76 |
| 8/12/14 | 102.848 | 134.962 |
| 8/13/14 | 102.947 | 135.352 |
| 8/14/14 | 103.093 | 135.465 |
| 8/15/14 | 103.336 | 135.579 |
| 8/18/14 | 103.224 | 135.868 |
| 8/19/14 | 103.166 | 136.06 |
| 8/20/14 | 103.049 | 136.102 |
| 8/21/14 | 103.116 | 136.129 |
| 8/22/14 | 103.16 | 136.109 |
| 8/25/14 | 103.266 | 136.118 |
| 8/26/14 | 103.305 | 136.212 |
| 8/27/14 | 103.386 | 136.164 |
| 8/28/14 | 103.533 | 136.214 |
| 8/29/14 | 103.569 | 136.23 |
| 9/2/14 | 103.224 | 136.057 |
| 9/3/14 | 103.152 | 135.89 |
| 9/4/14 | 102.992 | 135.641 |
| 9/5/14 | 102.979 | 135.338 |
| 9/8/14 | 102.91 | 135.188 |
| 9/9/14 | 102.636 | 134.826 |
| 9/10/14 | 102.415 | 134.318 |
| 9/11/14 | 102.404 | 134.077 |
| 9/12/14 | 102.066 | 133.947 |
| 9/15/14 | 102.058 | 133.746 |
| 9/16/14 | 102.079 | 133.58 |
| 9/17/14 | 102.06 | 133.729 |
| 9/18/14 | 101.895 | 133.842 |
| 9/19/14 | 102.051 | 133.984 |
| 9/22/14 | 102.194 | 133.817 |
| 9/23/14 | 102.265 | 133.321 |
| 9/24/14 | 102.135 | 133.064 |
| 9/25/14 | 102.162 | 132.238 |
| 9/26/14 | 101.911 | 131.656 |
| 9/29/14 | 101.987 | 131.223 |
| 9/30/14 | 101.995 | 131.89 |
| 10/1/14 | 102.349 | 132.149 |
| 10/2/14 | 102.373 | 132.201 |
| 10/3/14 | 102.345 | 132.64 |
| 10/6/14 | 102.56 | 132.946 |
| 10/7/14 | 102.76 | 132.603 |
| 10/8/14 | 102.816 | 132.383 |
| 10/9/14 | 102.873 | 131.878 |
| 10/10/14 | 102.843 | 131.266 |
| 10/13/14 | 102.861 | 131.314 |
| 10/14/14 | 103.153 | 130.54 |
| 10/15/14 | 103.63 | 129.86 |
| 10/16/14 | 103.21 | 130.301 |
| 10/17/14 | 103.149 | 132.001 |
| 10/20/14 | 103.206 | 132.057 |
| 10/21/14 | 103.156 | 132.922 |
| 10/22/14 | 103.063 | 133.044 |
| 10/23/14 | 102.823 | 133.165 |
| 10/24/14 | 102.843 | 133.183 |
| 10/27/14 | 102.852 | 132.995 |
| 10/28/14 | 102.764 | 133.102 |
| 10/29/14 | 102.545 | 132.948 |
| 10/30/14 | 102.596 | 132.859 |
| 10/31/14 | 102.445 | 133.107 |
| 11/3/14 | 102.344 | 133.133 |
| 11/4/14 | 102.35 | 132.642 |
| 11/5/14 | 102.221 | 132.701 |
| 11/6/14 | 102.127 | 132.705 |
| 11/7/14 | 102.255 | 132.638 |
| 11/10/14 | 102.218 | 132.691 |
| 11/11/14 | 102.225 | 132.81 |
| 11/12/14 | 102.112 | 132.619 |
| 11/13/14 | 102.052 | 132.412 |
| 11/14/14 | 102.008 | 132.145 |
| 11/17/14 | 101.894 | 131.772 |
| 11/18/14 | 101.843 | 131.427 |
| 11/19/14 | 101.695 | 131.083 |
| 11/20/14 | 101.809 | 131.09 |
| 11/21/14 | 102.03 | 131.414 |
| 11/24/14 | 102.171 | 131.531 |
| 11/25/14 | 102.338 | 131.588 |
| 11/26/14 | 102.539 | 131.644 |
| 11/28/14 | 102.655 | 131.425 |
| 12/1/14 | 102.559 | 130.466 |
| 12/2/14 | 102.141 | 129.983 |
| 12/3/14 | 102.081 | 130.038 |
| 12/4/14 | 102.177 | 129.993 |
| 12/5/14 | 101.947 | 129.782 |
| 12/8/14 | 101.994 | 129.233 |
| 12/9/14 | 102.101 | 128.353 |
| 12/10/14 | 102.099 | 127.663 |
| 12/11/14 | 102.021 | 127.356 |
| 12/12/14 | 102.212 | 126.57 |
| 12/15/14 | 101.978 | 125.84 |
| 12/16/14 | 101.885 | 125.12 |
| 12/17/14 | 101.994 | 126.235 |
| 12/18/14 | 101.843 | 127.8 |
| 12/19/14 | 102.027 | 128.272 |
| 12/22/14 | 102.137 | 128.584 |
| 12/23/14 | 102.011 | 128.794 |
| 12/24/14 | 101.848 | 128.833 |
| 12/26/14 | 101.905 | 128.825 |
| 12/29/14 | 102.054 | 128.921 |
| 12/30/14 | 102.239 | 128.765 |
| 12/31/14 | 102.233 | 128.769 |
| 1/2/15 | 102.426 | 128.911 |
| 1/5/15 | 102.586 | 128.223 |
| 1/6/15 | 102.878 | 127.662 |
| 1/7/15 | 102.893 | 128.095 |
| 1/8/15 | 102.797 | 128.789 |
| 1/9/15 | 102.956 | 128.868 |
| 1/12/15 | 103.094 | 128.728 |
| 1/13/15 | 103.116 | 128.583 |
| 1/14/15 | 103.282 | 128.28 |
| 1/15/15 | 103.445 | 128.444 |
| 1/16/15 | 103.218 | 128.331 |
| 1/20/15 | 103.176 | 128.203 |
| 1/21/15 | 103.074 | 128.203 |
| 1/22/15 | 102.998 | 128.455 |
| 1/23/15 | 103.395 | 128.628 |
| 1/26/15 | 103.388 | 128.595 |
| 1/27/15 | 103.486 | 128.767 |
| 1/28/15 | 103.616 | 128.923 |
| 1/29/15 | 103.575 | 128.896 |
| 1/30/15 | 103.915 | 128.884 |
| 2/2/15 | 103.902 | 128.826 |
| 2/3/15 | 103.611 | 129.307 |
| 2/4/15 | 103.464 | 129.573 |
| 2/5/15 | 103.571 | 129.826 |
| 2/6/15 | 103.134 | 130.204 |
| 2/9/15 | 103.034 | 130.169 |
| 2/10/15 | 102.809 | 130.199 |
| 2/11/15 | 102.739 | 130.053 |
| 2/12/15 | 102.846 | 130.105 |
| 2/13/15 | 102.803 | 130.334 |
| 2/17/15 | 102.437 | 130.465 |
| 2/18/15 | 102.543 | 130.673 |
| 2/19/15 | 102.623 | 130.581 |
| 2/20/15 | 102.701 | 130.602 |
| 2/23/15 | 102.76 | 130.717 |
| 2/24/15 | 103.054 | 130.904 |
| 2/25/15 | 103.205 | 131.093 |
| 2/26/15 | 103.084 | 131.259 |
| 2/27/15 | 103.014 | 131.346 |
| 3/2/15 | 102.766 | 131.232 |
| 3/3/15 | 102.641 | 131.019 |
| 3/4/15 | 102.55 | 130.662 |
| 3/5/15 | 102.571 | 130.64 |
| 3/6/15 | 102.05 | 130.229 |
| 3/9/15 | 102.107 | 129.958 |
| 3/10/15 | 102.236 | 129.348 |
| 3/11/15 | 102.218 | 129.308 |
| 3/12/15 | 102.373 | 129.437 |
| 3/13/15 | 102.12 | 128.915 |
| 3/16/15 | 102.092 | 128.692 |
| 3/17/15 | 102.088 | 128.301 |
| 3/18/15 | 102.392 | 128.399 |
| 3/19/15 | 102.637 | 128.765 |
| 3/20/15 | 102.778 | 128.818 |
| 3/23/15 | 102.9 | 128.891 |
| 3/24/15 | 103.067 | 129.136 |
| 3/25/15 | 102.948 | 129.155 |
| 3/26/15 | 102.572 | 129.012 |
| 3/27/15 | 102.722 | 129.135 |
| 3/30/15 | 102.816 | 129.18 |
| 3/31/15 | 102.97 | 129.203 |
| 4/1/15 | 103.346 | 129.242 |
| 4/2/15 | 103.283 | 129.384 |
| 4/6/15 | 103.281 | 129.514 |
| 4/7/15 | 103.339 | 129.813 |
| 4/8/15 | 103.385 | 130.12 |
| 4/9/15 | 103.25 | 130.08 |
| 4/10/15 | 103.269 | 130.183 |
| 4/13/15 | 103.225 | 130.222 |
| 4/14/15 | 103.502 | 130.217 |
| 4/15/15 | 103.476 | 130.43 |
| 4/16/15 | 103.412 | 130.52 |
| 4/17/15 | 103.448 | 130.393 |
| 4/20/15 | 103.374 | 130.451 |
| 4/21/15 | 103.344 | 130.415 |
| 4/22/15 | 103.073 | 130.258 |
| 4/23/15 | 103.075 | 130.272 |
| 4/24/15 | 103.252 | 130.37 |
| 4/27/15 | 103.2 | 130.372 |
| 4/28/15 | 102.95 | 130.305 |
| 4/29/15 | 102.411 | 130.069 |
| 4/30/15 | 102.251 | 129.999 |
| 5/1/15 | 102.081 | 130.001 |
| 5/4/15 | 101.991 | 130.107 |
| 5/5/15 | 101.745 | 130.012 |
| 5/6/15 | 101.469 | 129.725 |
| 5/7/15 | 101.552 | 129.512 |
| 5/8/15 | 101.879 | 129.87 |
| 5/11/15 | 101.525 | 129.898 |
| 5/12/15 | 101.269 | 129.438 |
| 5/13/15 | 101.316 | 129.534 |
| 5/14/15 | 101.397 | 129.569 |
| 5/15/15 | 101.81 | 129.716 |
| 5/18/15 | 101.582 | 129.614 |
| 5/19/15 | 101.262 | 129.456 |
| 5/20/15 | 101.187 | 129.294 |
| 5/21/15 | 101.333 | 129.372 |
| 5/22/15 | 101.31 | 129.503 |
| 5/26/15 | 101.519 | 129.524 |
| 5/27/15 | 101.506 | 129.504 |
| 5/28/15 | 101.507 | 129.417 |
| 5/29/15 | 101.544 | 129.539 |
| 6/1/15 | 101.222 | 129.422 |
| 6/2/15 | 100.801 | 129.253 |
| 6/3/15 | 100.493 | 128.955 |
| 6/4/15 | 100.607 | 128.669 |
| 6/5/15 | 100.338 | 128.185 |
| 6/8/15 | 100.328 | 127.981 |
| 6/9/15 | 100.063 | 127.603 |
| 6/10/15 | 99.766 | 127.441 |
| 6/11/15 | 100.019 | 127.722 |
| 6/12/15 | 100.209 | 127.509 |
| 6/15/15 | 100.183 | 127.18 |
| 6/16/15 | 100.204 | 127.036 |
| 6/17/15 | 100.102 | 127.086 |
| 6/18/15 | 100.13 | 127.235 |
| 6/19/15 | 100.39 | 127.422 |
| 6/22/15 | 100.096 | 127.586 |
| 6/23/15 | 99.909 | 127.511 |
| 6/24/15 | 99.918 | 127.359 |
| 6/25/15 | 99.854 | 127.195 |
| 6/26/15 | 99.62 | 126.893 |
| 6/29/15 | 99.884 | 126.158 |
| 6/30/15 | 100.037 | 126.2 |
| 7/1/15 | 99.808 | 126.273 |
| 7/2/15 | 99.959 | 126.354 |
| 7/6/15 | 100.232 | 125.966 |
| 7/7/15 | 100.504 | 125.596 |
| 7/8/15 | 100.46 | 125.367 |
| 7/9/15 | 100.206 | 125.508 |
| 7/10/15 | 99.759 | 125.61 |
| 7/13/15 | 99.543 | 125.751 |
| 7/14/15 | 99.576 | 125.717 |
| 7/15/15 | 99.661 | 125.833 |
| 7/16/15 | 99.721 | 125.742 |
| 7/17/15 | 99.787 | 125.286 |
| 7/20/15 | 99.6 | 124.999 |
| 7/21/15 | 99.649 | 124.522 |
| 7/22/15 | 99.72 | 123.795 |
| 7/23/15 | 99.744 | 123.523 |
| 7/24/15 | 99.803 | 123.3 |
| 7/27/15 | 99.786 | 122.67 |
| 7/28/15 | 99.739 | 122.649 |
| 7/29/15 | 99.618 | 123.461 |
| 7/30/15 | 99.685 | 123.964 |
| 7/31/15 | 99.954 | 123.922 |
| 8/3/15 | 100.094 | 123.653 |
| 8/4/15 | 99.962 | 123.719 |
| 8/5/15 | 99.584 | 123.491 |
| 8/6/15 | 99.586 | 122.954 |
| 8/7/15 | 99.668 | 122.503 |
| 8/10/15 | 99.471 | 122.46 |
| 8/11/15 | 99.769 | 121.721 |
| 8/12/15 | 99.692 | 121.342 |
| 8/13/15 | 99.468 | 121.66 |
| 8/14/15 | 99.448 | 121.642 |
| 8/17/15 | 99.602 | 121.654 |
| 8/18/15 | 99.477 | 121.633 |
| 8/19/15 | 99.424 | 121.252 |
| 8/20/15 | 99.586 | 120.824 |
| 8/21/15 | 99.626 | 120.461 |
| 8/24/15 | 99.414 | 119.113 |
| 8/25/15 | 99.195 | 119.971 |
| 8/26/15 | 98.899 | 119.946 |
| 8/27/15 | 99.074 | 120.628 |
| 8/28/15 | 99.244 | 120.939 |
| 8/31/15 | 99.217 | 121.131 |
| 9/1/15 | 99.152 | 120.781 |
| 9/2/15 | 99.203 | 120.942 |
| 9/3/15 | 99.347 | 121.372 |
| 9/4/15 | 99.526 | 121.243 |
| 9/8/15 | 99.36 | 121.524 |
| 9/9/15 | 99.315 | 121.732 |
| 9/10/15 | 99.219 | 121.563 |
| 9/11/15 | 99.299 | 121.587 |
| 9/14/15 | 99.28 | 121.4 |
| 9/15/15 | 98.987 | 121.19 |
| 9/16/15 | 98.862 | 120.73 |
| 9/17/15 | 99.061 | 120.585 |
| 9/18/15 | 99.563 | 120.333 |
| 9/21/15 | 99.399 | 120.151 |
| 9/22/15 | 99.494 | 119.36 |
| 9/23/15 | 99.371 | 119.122 |
| 9/24/15 | 99.35 | 118.157 |
| 9/25/15 | 99.1 | 117.905 |
| 9/28/15 | 99.012 | 116.226 |
| 9/29/15 | 98.984 | 115.614 |
| 9/30/15 | 99.07 | 116.002 |
| 10/1/15 | 99.06 | 115.948 |
| 10/2/15 | 99.323 | 115.684 |
| 10/5/15 | 99.23 | 116.623 |
| 10/6/15 | 99.352 | 117.736 |
| 10/7/15 | 99.51 | 119.116 |
| 10/8/15 | 99.412 | 119.115 |
| 10/9/15 | 99.403 | 120.047 |
| 10/12/15 | 99.475 | 120.06 |
| 10/13/15 | 99.568 | 119.722 |
| 10/14/15 | 99.799 | 119.376 |
| 10/15/15 | 99.747 | 119.342 |
| 10/16/15 | 99.774 | 119.841 |
| 10/19/15 | 99.716 | 119.878 |
| 10/20/15 | 99.599 | 120.046 |
| 10/21/15 | 99.843 | 120.27 |
| 10/22/15 | 99.962 | 120.041 |
| 10/23/15 | 99.839 | 120.443 |
| 10/26/15 | 99.988 | 120.39 |
| 10/27/15 | 100.024 | 120.083 |
| 10/28/15 | 99.784 | 120.133 |
| 10/29/15 | 99.366 | 120.237 |
| 10/30/15 | 99.366 | 120.195 |
| 11/2/15 | 99.31 | 120.487 |
| 11/3/15 | 99.232 | 120.637 |
| 11/4/15 | 99.181 | 120.753 |
| 11/5/15 | 99.133 | 120.502 |
| 11/6/15 | 98.802 | 119.883 |
| 11/9/15 | 98.639 | 119.13 |
| 11/10/15 | 98.69 | 118.692 |
| 11/11/15 | 98.74 | 118.736 |
| 11/12/15 | 98.611 | 118.014 |
| 11/13/15 | 98.747 | 117.394 |
| 11/16/15 | 98.823 | 117.075 |
| 11/17/15 | 98.766 | 117.548 |
| 11/18/15 | 98.769 | 117.423 |
| 11/19/15 | 98.972 | 116.89 |
| 11/20/15 | 98.935 | 116.829 |
| 11/23/15 | 98.87 | 116.393 |
| 11/24/15 | 98.906 | 116.043 |
| 11/25/15 | 98.93 | 116.051 |
| 11/27/15 | 98.976 | 115.977 |
| 11/30/15 | 98.929 | 116.132 |
| 12/1/15 | 99.197 | 116.463 |
| 12/2/15 | 99.116 | 116.678 |
| 12/3/15 | 98.476 | 116.209 |
| 12/4/15 | 98.55 | 115.723 |
| 12/7/15 | 98.714 | 114.95 |
| 12/8/15 | 98.535 | 113.929 |
| 12/9/15 | 98.493 | 113.937 |
| 12/10/15 | 98.415 | 113.616 |
| 12/11/15 | 98.408 | 112.053 |
| 12/14/15 | 97.875 | 110.398 |
| 12/15/15 | 97.724 | 111.331 |
| 12/16/15 | 97.692 | 111.756 |
| 12/17/15 | 97.923 | 111.719 |
| 12/18/15 | 98.016 | 110.876 |
| 12/21/15 | 98.036 | 110.761 |
| 12/22/15 | 97.906 | 111.06 |
| 12/23/15 | 97.884 | 111.633 |
| 12/24/15 | 97.951 | 111.817 |
| 12/28/15 | 98.048 | 111.751 |
| 12/29/15 | 97.858 | 112.132 |
| 12/30/15 | 97.834 | 112.194 |
| 12/31/15 | 97.954 | 112.164 |